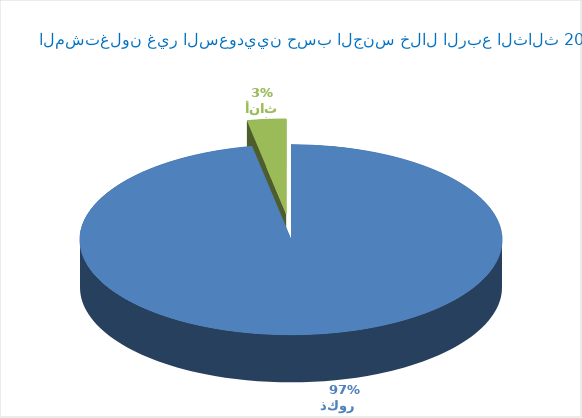
| Category | Series 0 |
|---|---|
| ذكور    | 4627812 |
| أناث | 141918 |